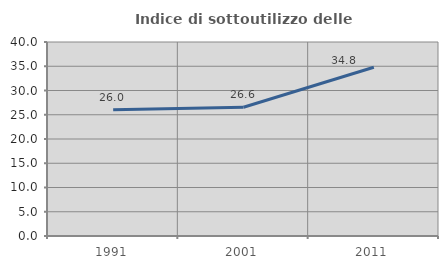
| Category | Indice di sottoutilizzo delle abitazioni  |
|---|---|
| 1991.0 | 26.007 |
| 2001.0 | 26.555 |
| 2011.0 | 34.783 |